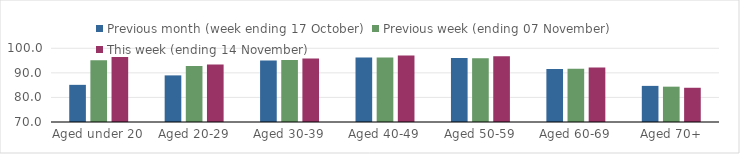
| Category | Previous month (week ending 17 October) | Previous week (ending 07 November) | This week (ending 14 November) |
|---|---|---|---|
| Aged under 20 | 85.12 | 95.17 | 96.44 |
| Aged 20-29 | 88.97 | 92.75 | 93.38 |
| Aged 30-39 | 95.02 | 95.21 | 95.87 |
| Aged 40-49 | 96.27 | 96.22 | 97.09 |
| Aged 50-59 | 96.03 | 95.97 | 96.71 |
| Aged 60-69 | 91.6 | 91.67 | 92.19 |
| Aged 70+ | 84.7 | 84.38 | 83.93 |